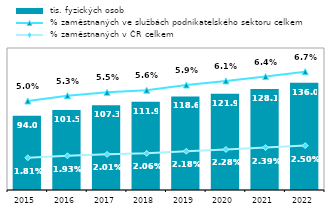
| Category |  tis. fyzických osob |
|---|---|
| 2015.0 | 94.048 |
| 2016.0 | 101.515 |
| 2017.0 | 107.325 |
| 2018.0 | 111.859 |
| 2019.0 | 118.573 |
| 2020.0 | 121.879 |
| 2021.0 | 128.078 |
| 2022.0 | 135.984 |